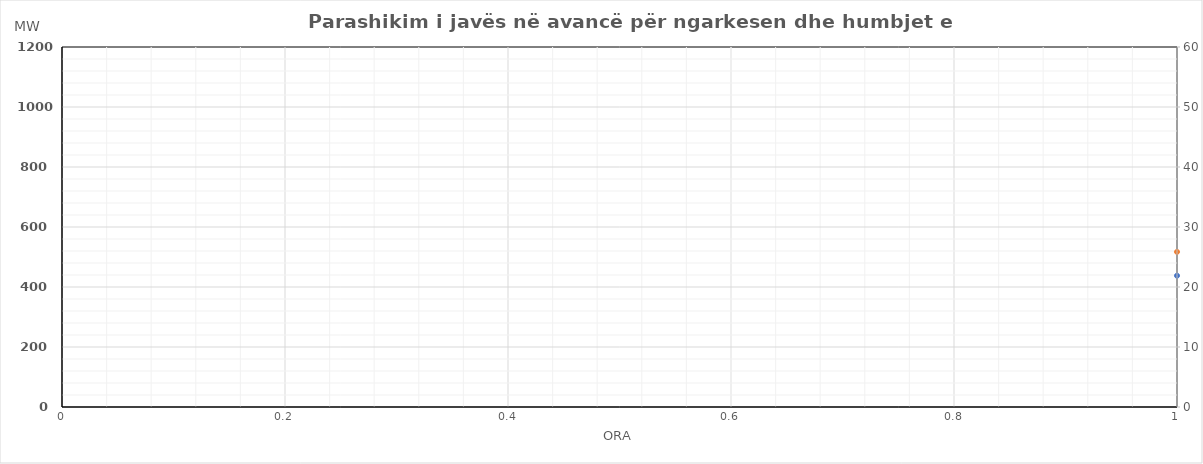
| Category | Ngarkesa (MWh) |
|---|---|
| 0 | 517.04 |
| 1 | 484.89 |
| 2 | 470.2 |
| 3 | 469.57 |
| 4 | 483.6 |
| 5 | 550.18 |
| 6 | 694.89 |
| 7 | 832.9 |
| 8 | 844.66 |
| 9 | 818.18 |
| 10 | 808.33 |
| 11 | 802.56 |
| 12 | 806.36 |
| 13 | 837.17 |
| 14 | 766.8 |
| 15 | 781.77 |
| 16 | 813.96 |
| 17 | 881.22 |
| 18 | 871.58 |
| 19 | 874.08 |
| 20 | 817.91 |
| 21 | 725.11 |
| 22 | 619.39 |
| 23 | 553.26 |
| 24 | 518.46 |
| 25 | 484.29 |
| 26 | 475.21 |
| 27 | 470.87 |
| 28 | 479.49 |
| 29 | 545 |
| 30 | 687.43 |
| 31 | 828.01 |
| 32 | 843.31 |
| 33 | 820.99 |
| 34 | 799.5 |
| 35 | 796.01 |
| 36 | 767.39 |
| 37 | 792.58 |
| 38 | 812.06 |
| 39 | 829.12 |
| 40 | 894.2 |
| 41 | 982.47 |
| 42 | 972.88 |
| 43 | 936.04 |
| 44 | 879.92 |
| 45 | 789.43 |
| 46 | 689.07 |
| 47 | 590.01 |
| 48 | 525.9 |
| 49 | 489.33 |
| 50 | 485.5 |
| 51 | 482.81 |
| 52 | 493.69 |
| 53 | 545.11 |
| 54 | 678.03 |
| 55 | 821.43 |
| 56 | 848.77 |
| 57 | 828.32 |
| 58 | 826.53 |
| 59 | 840.61 |
| 60 | 932.51 |
| 61 | 868.26 |
| 62 | 891.99 |
| 63 | 870.26 |
| 64 | 948.18 |
| 65 | 1062.39 |
| 66 | 1065.97 |
| 67 | 1035.82 |
| 68 | 977.22 |
| 69 | 839.27 |
| 70 | 754.9 |
| 71 | 680.91 |
| 72 | 531.37 |
| 73 | 506.54 |
| 74 | 502.24 |
| 75 | 498.74 |
| 76 | 500.33 |
| 77 | 533.81 |
| 78 | 649.31 |
| 79 | 795.42 |
| 80 | 796.17 |
| 81 | 789.56 |
| 82 | 772 |
| 83 | 766.35 |
| 84 | 759.43 |
| 85 | 777.97 |
| 86 | 791.07 |
| 87 | 803.46 |
| 88 | 848.71 |
| 89 | 945.61 |
| 90 | 941.79 |
| 91 | 910.09 |
| 92 | 867.81 |
| 93 | 783.85 |
| 94 | 682.08 |
| 95 | 580.48 |
| 96 | 541.6 |
| 97 | 506.54 |
| 98 | 495.06 |
| 99 | 496.82 |
| 100 | 499.41 |
| 101 | 565.18 |
| 102 | 714.83 |
| 103 | 866.82 |
| 104 | 894.75 |
| 105 | 922.48 |
| 106 | 933.51 |
| 107 | 945.99 |
| 108 | 937.17 |
| 109 | 900.6 |
| 110 | 915.43 |
| 111 | 892.28 |
| 112 | 942.35 |
| 113 | 957.75 |
| 114 | 973.35 |
| 115 | 972.18 |
| 116 | 953.92 |
| 117 | 861.82 |
| 118 | 780.81 |
| 119 | 702.89 |
| 120 | 543.45 |
| 121 | 501.59 |
| 122 | 485.6 |
| 123 | 468.83 |
| 124 | 478.88 |
| 125 | 525.74 |
| 126 | 676.52 |
| 127 | 813.21 |
| 128 | 927.43 |
| 129 | 1004.98 |
| 130 | 1066.4 |
| 131 | 1081.37 |
| 132 | 987.35 |
| 133 | 967.53 |
| 134 | 945.22 |
| 135 | 921.03 |
| 136 | 932.36 |
| 137 | 996.47 |
| 138 | 1053.65 |
| 139 | 882.64 |
| 140 | 827.08 |
| 141 | 738.1 |
| 142 | 635.36 |
| 143 | 567.87 |
| 144 | 571.95 |
| 145 | 528.16 |
| 146 | 509.31 |
| 147 | 503.5 |
| 148 | 515.49 |
| 149 | 540.79 |
| 150 | 624.49 |
| 151 | 792.9 |
| 152 | 892.61 |
| 153 | 948.58 |
| 154 | 964.71 |
| 155 | 952.21 |
| 156 | 904.67 |
| 157 | 892.99 |
| 158 | 856.84 |
| 159 | 852.32 |
| 160 | 949.31 |
| 161 | 1018.93 |
| 162 | 1034.85 |
| 163 | 982.75 |
| 164 | 927.27 |
| 165 | 828.93 |
| 166 | 722.74 |
| 167 | 626.07 |